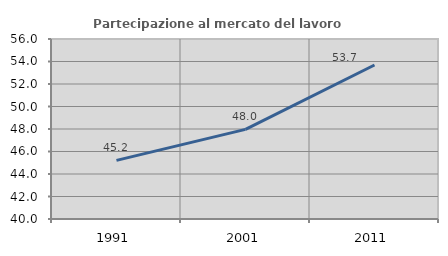
| Category | Partecipazione al mercato del lavoro  femminile |
|---|---|
| 1991.0 | 45.215 |
| 2001.0 | 47.965 |
| 2011.0 | 53.69 |